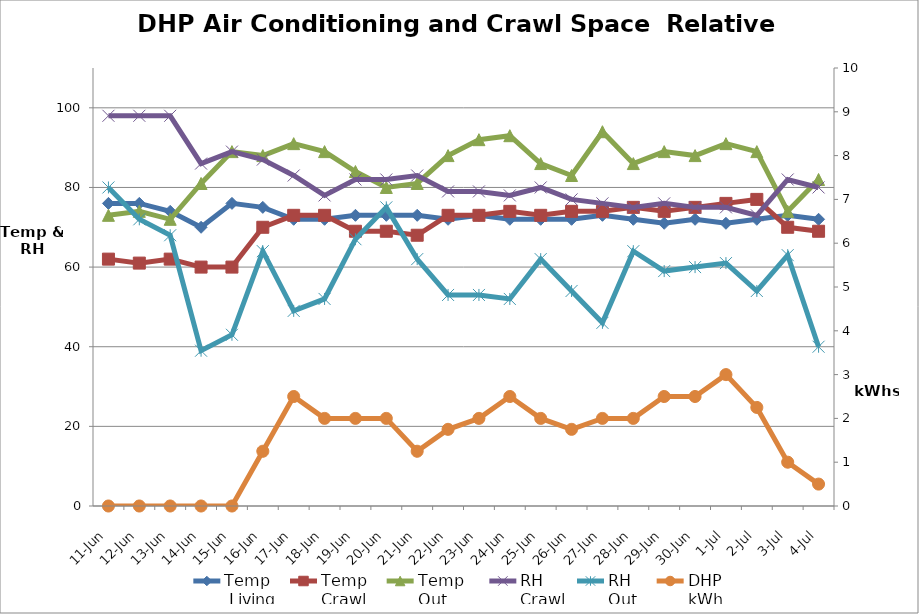
| Category | Temp
 Living | Temp
Crawl | Temp 
Out | RH
Crawl | RH 
Out |
|---|---|---|---|---|---|
| 2014-06-11 | 76 | 62 | 73 | 98 | 80 |
| 2014-06-12 | 76 | 61 | 74 | 98 | 72 |
| 2014-06-13 | 74 | 62 | 72 | 98 | 68 |
| 2014-06-14 | 70 | 60 | 81 | 86 | 39 |
| 2014-06-15 | 76 | 60 | 89 | 89 | 43 |
| 2014-06-16 | 75 | 70 | 88 | 87 | 64 |
| 2014-06-17 | 72 | 73 | 91 | 83 | 49 |
| 2014-06-18 | 72 | 73 | 89 | 78 | 52 |
| 2014-06-19 | 73 | 69 | 84 | 82 | 67 |
| 2014-06-20 | 73 | 69 | 80 | 82 | 75 |
| 2014-06-21 | 73 | 68 | 81 | 83 | 62 |
| 2014-06-22 | 72 | 73 | 88 | 79 | 53 |
| 2014-06-23 | 73 | 73 | 92 | 79 | 53 |
| 2014-06-24 | 72 | 74 | 93 | 78 | 52 |
| 2014-06-25 | 72 | 73 | 86 | 80 | 62 |
| 2014-06-26 | 72 | 74 | 83 | 77 | 54 |
| 2014-06-27 | 73 | 74 | 94 | 76 | 46 |
| 2014-06-28 | 72 | 75 | 86 | 75 | 64 |
| 2014-06-29 | 71 | 74 | 89 | 76 | 59 |
| 2014-06-30 | 72 | 75 | 88 | 75 | 60 |
| 2014-07-01 | 71 | 76 | 91 | 75 | 61 |
| 2014-07-02 | 72 | 77 | 89 | 73 | 54 |
| 2014-07-03 | 73 | 70 | 74 | 82 | 63 |
| 2014-07-04 | 72 | 69 | 82 | 80 | 40 |